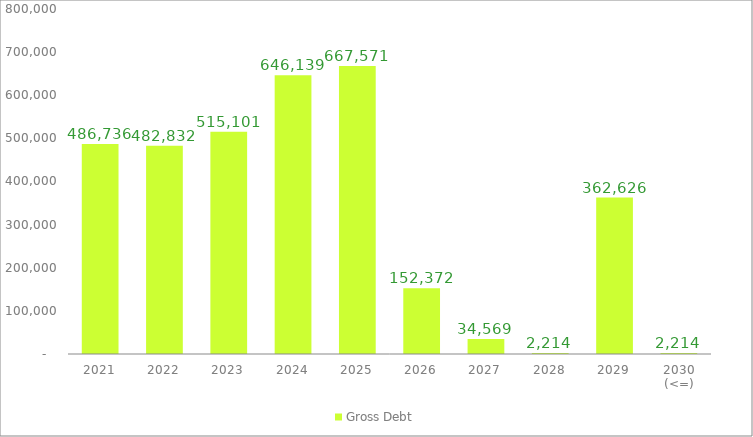
| Category | Gross Debt |
|---|---|
| 2021 | 486735.931 |
| 2022 | 482832.109 |
| 2023 | 515101.415 |
| 2024 | 646139.18 |
| 2025 | 667570.668 |
| 2026 | 152372.373 |
| 2027 | 34568.662 |
| 2028 | 2213.704 |
| 2029 | 362626.204 |
| 2030 (<=) | 2213.704 |